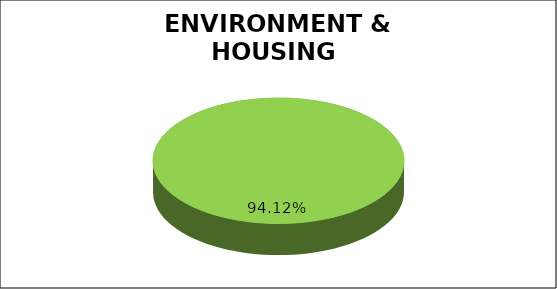
| Category | Green | Amber | Red |
|---|---|---|---|
| Q3 | 0.941 | 0 | 0.059 |